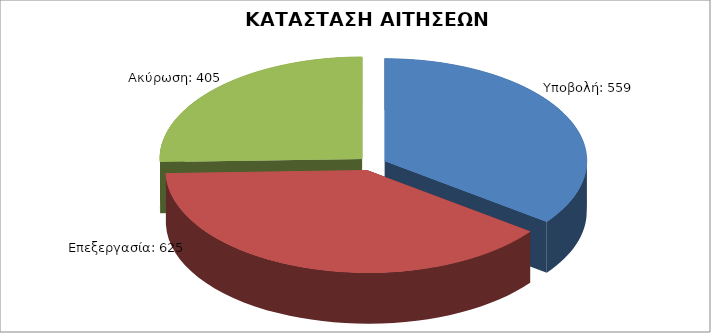
| Category | Series 0 |
|---|---|
| Υποβολή: | 559 |
| Επεξεργασία: | 625 |
| Ακύρωση: | 405 |